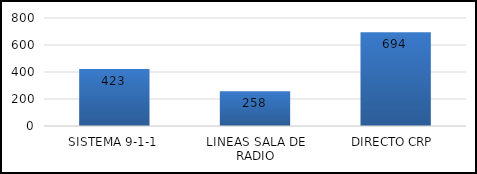
| Category | TOTAL |
|---|---|
| SISTEMA 9-1-1 | 423 |
| LINEAS SALA DE RADIO | 258 |
| DIRECTO CRP  | 694 |